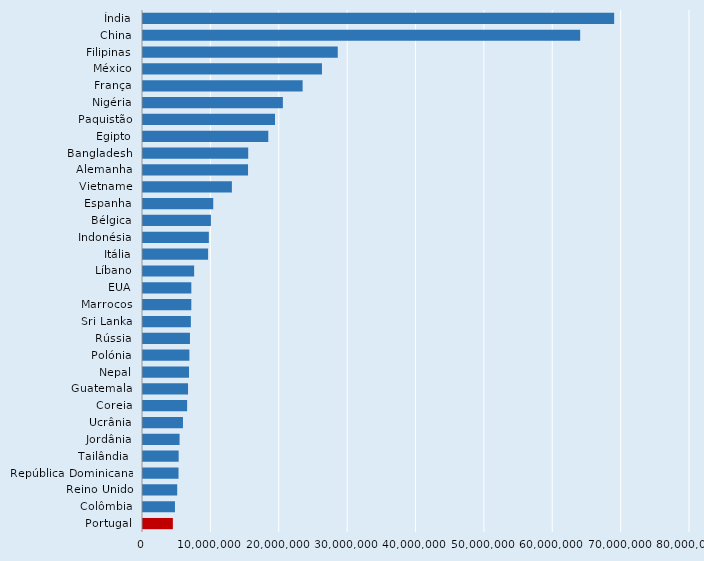
| Category | Series 0 |
|---|---|
| Índia | 68909757.726 |
| China | 63937646.592 |
| Filipinas | 28482734.08 |
| México | 26171339.392 |
| França | 23347125.408 |
| Nigéria | 20459152.346 |
| Paquistão | 19306000.128 |
| Egipto | 18325400.537 |
| Bangladesh | 15387890.016 |
| Alemanha | 15362079.308 |
| Vietname | 13000000 |
| Espanha | 10273711.872 |
| Bélgica | 9933945.976 |
| Indonésia | 9630966.355 |
| Itália | 9517018.368 |
| Líbano | 7480817.088 |
| EUA | 7069000.192 |
| Marrocos | 7066596.864 |
| Sri Lanka | 6999731.312 |
| Rússia | 6869649.92 |
| Polónia | 6784999.936 |
| Nepal | 6729935.776 |
| Guatemala | 6587500.064 |
| Coreia | 6453500.096 |
| Ucrânia | 5845000.064 |
| Jordânia | 5348310.048 |
| Tailândia  | 5217653.376 |
| República Dominicana | 5196200.064 |
| Reino Unido | 5003393.536 |
| Colômbia | 4674661.084 |
| Portugal | 4367727.296 |